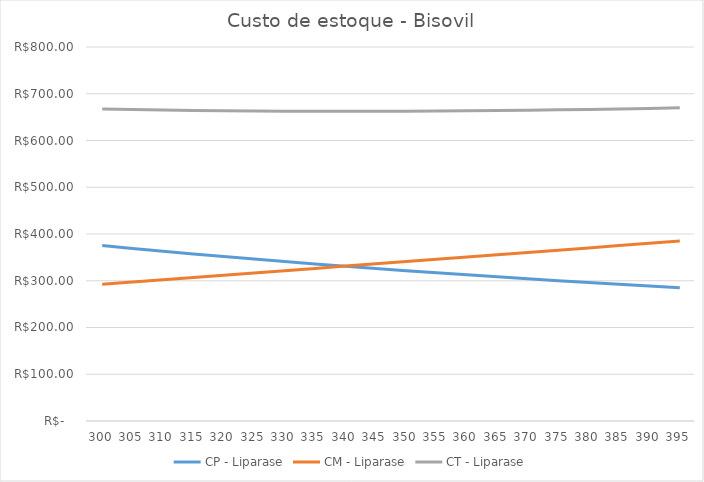
| Category | CP - Liparase | CM - Liparase | CT - Liparase |
|---|---|---|---|
| 300.0 | 375.229 | 292.32 | 667.549 |
| 305.0 | 369.078 | 297.192 | 666.27 |
| 310.0 | 363.125 | 302.064 | 665.189 |
| 315.0 | 357.361 | 306.936 | 664.297 |
| 320.0 | 351.777 | 311.808 | 663.585 |
| 325.0 | 346.365 | 316.68 | 663.045 |
| 330.0 | 341.117 | 321.552 | 662.669 |
| 335.0 | 336.026 | 326.424 | 662.45 |
| 340.0 | 331.084 | 331.296 | 662.38 |
| 345.0 | 326.286 | 336.168 | 662.454 |
| 350.0 | 321.625 | 341.04 | 662.665 |
| 355.0 | 317.095 | 345.912 | 663.007 |
| 360.0 | 312.691 | 350.784 | 663.475 |
| 365.0 | 308.407 | 355.656 | 664.063 |
| 370.0 | 304.24 | 360.528 | 664.768 |
| 375.0 | 300.183 | 365.4 | 665.583 |
| 380.0 | 296.233 | 370.272 | 666.505 |
| 385.0 | 292.386 | 375.144 | 667.53 |
| 390.0 | 288.638 | 380.016 | 668.654 |
| 395.0 | 284.984 | 384.888 | 669.872 |